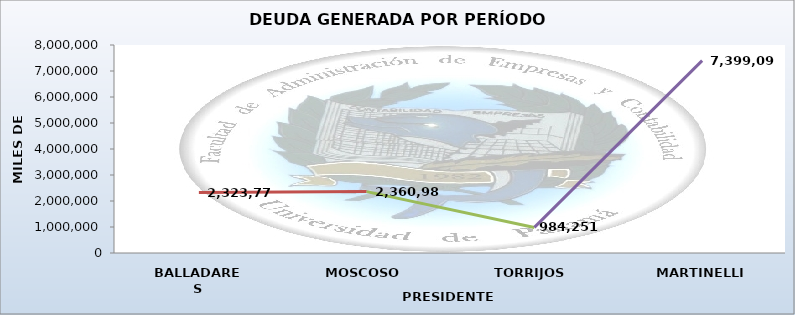
| Category | Series 0 |
|---|---|
| BALLADARES | 2323773 |
| MOSCOSO | 2360980 |
| TORRIJOS | 984251 |
| MARTINELLI | 7399089.672 |